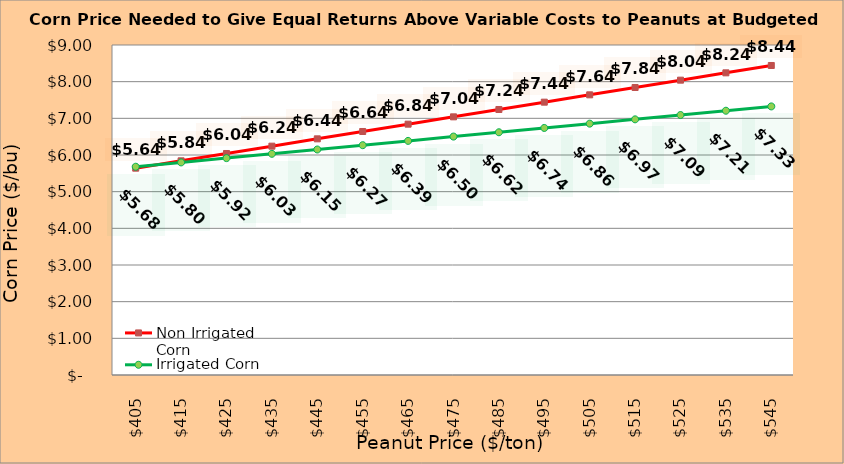
| Category | Non Irrigated Corn | Irrigated Corn |
|---|---|---|
| 405.0 | 5.641 | 5.68 |
| 415.0 | 5.841 | 5.798 |
| 425.0 | 6.041 | 5.915 |
| 435.0 | 6.241 | 6.033 |
| 445.0 | 6.441 | 6.15 |
| 455.0 | 6.641 | 6.268 |
| 465.0 | 6.841 | 6.385 |
| 475.0 | 7.041 | 6.503 |
| 485.0 | 7.241 | 6.62 |
| 495.0 | 7.441 | 6.738 |
| 505.0 | 7.641 | 6.855 |
| 515.0 | 7.841 | 6.973 |
| 525.0 | 8.041 | 7.09 |
| 535.0 | 8.241 | 7.208 |
| 545.0 | 8.441 | 7.325 |